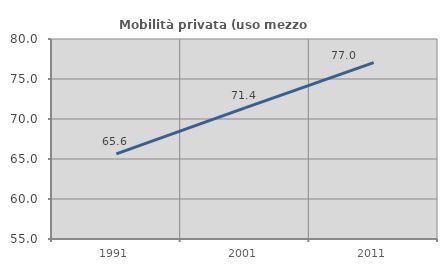
| Category | Mobilità privata (uso mezzo privato) |
|---|---|
| 1991.0 | 65.636 |
| 2001.0 | 71.389 |
| 2011.0 | 77.049 |